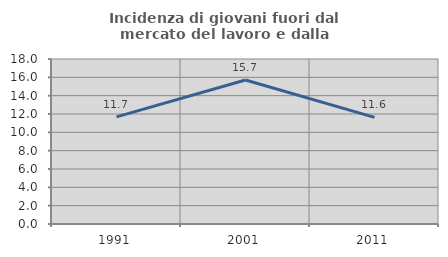
| Category | Incidenza di giovani fuori dal mercato del lavoro e dalla formazione  |
|---|---|
| 1991.0 | 11.685 |
| 2001.0 | 15.714 |
| 2011.0 | 11.632 |